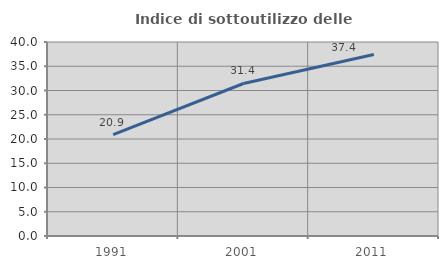
| Category | Indice di sottoutilizzo delle abitazioni  |
|---|---|
| 1991.0 | 20.915 |
| 2001.0 | 31.445 |
| 2011.0 | 37.436 |